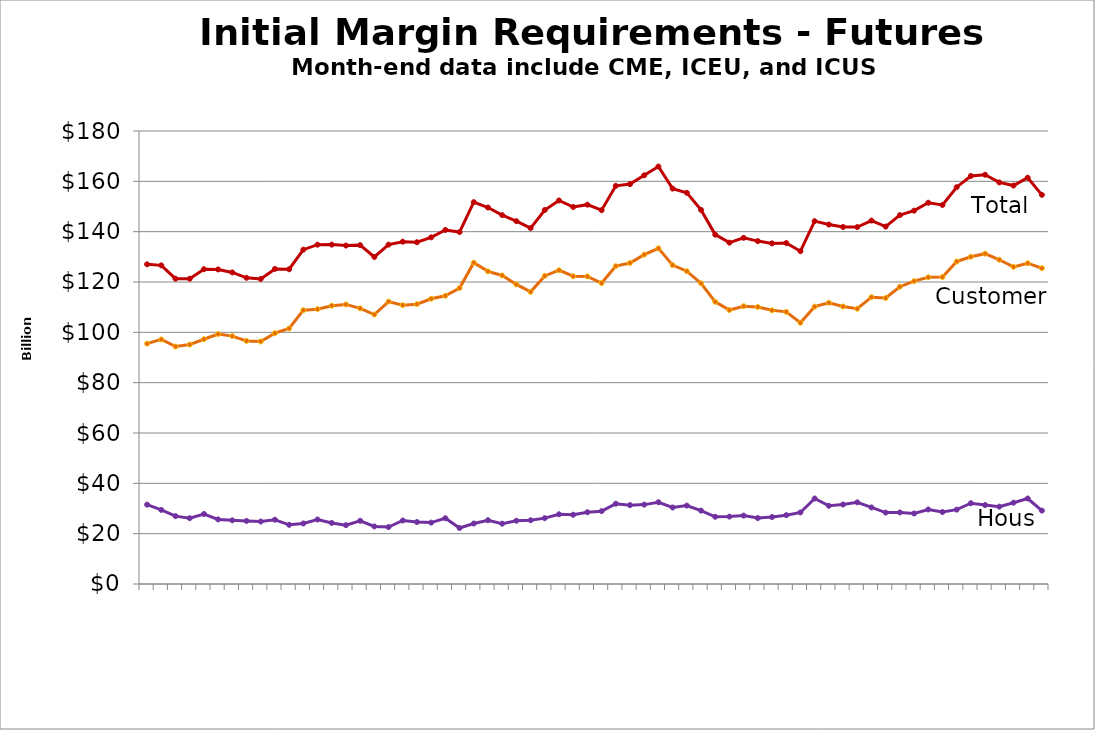
| Category | Customer | House | Total |
|---|---|---|---|
| nan |  |  |  |
| 2014-03-31 |  |  |  |
| nan |  |  |  |
| 2014-05-30 |  |  |  |
| nan |  |  |  |
| 2014-07-31 |  |  |  |
| nan |  |  |  |
| 2014-09-30 |  |  |  |
| nan |  |  |  |
| 2014-11-28 |  |  |  |
| nan |  |  |  |
| 2015-01-30 |  |  |  |
| nan |  |  |  |
| 2015-03-31 |  |  |  |
| nan |  |  |  |
| 2015-05-29 |  |  |  |
| nan |  |  |  |
| 2015-07-31 |  |  |  |
| nan |  |  |  |
| 2015-09-30 |  |  |  |
| nan |  |  |  |
| 2015-11-30 |  |  |  |
| nan |  |  |  |
| 2016-01-29 |  |  |  |
| nan |  |  |  |
| 2016-03-31 |  |  |  |
| nan |  |  |  |
| 2016-05-31 |  |  |  |
| nan |  |  |  |
| 2016-07-29 |  |  |  |
| nan |  |  |  |
| 2016-09-30 |  |  |  |
| nan |  |  |  |
| 2016-11-30 |  |  |  |
| nan |  |  |  |
| 2017-01-31 |  |  |  |
| nan |  |  |  |
| 2017-03-31 |  |  |  |
| nan |  |  |  |
| 2017-05-31 |  |  |  |
| nan |  |  |  |
| 2017-07-31 |  |  |  |
| nan |  |  |  |
| 2017-09-29 |  |  |  |
| nan |  |  |  |
| 2017-11-30 |  |  |  |
| nan |  |  |  |
| 2018-01-31 |  |  |  |
| nan |  |  |  |
| 2018-03-29 |  |  |  |
| nan |  |  |  |
| 2018-05-31 |  |  |  |
| nan |  |  |  |
| 2018-07-31 |  |  |  |
| nan |  |  |  |
| 2018-09-28 |  |  |  |
| nan |  |  |  |
| 2018-11-30 |  |  |  |
| nan |  |  |  |
| 2019-01-31 |  |  |  |
| nan |  |  |  |
| 2019-03-29 |  |  |  |
| nan |  |  |  |
| 2019-05-31 |  |  |  |